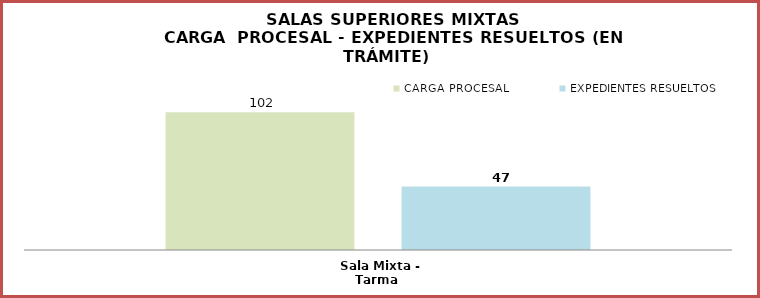
| Category | CARGA PROCESAL | EXPEDIENTES RESUELTOS |
|---|---|---|
| Sala Mixta - Tarma | 102 | 47 |